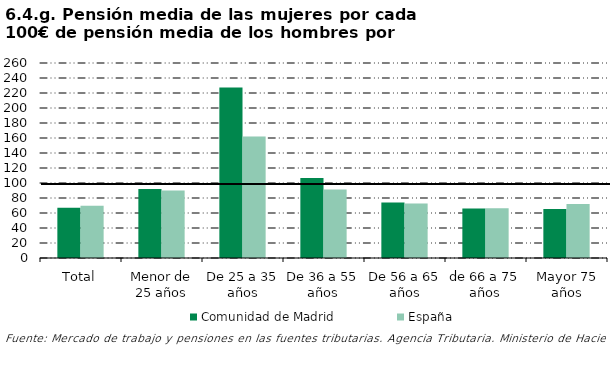
| Category | Comunidad de Madrid | España |
|---|---|---|
| Total | 66.907 | 69.539 |
| Menor de 25 años | 91.849 | 90.013 |
| De 25 a 35 años | 227.292 | 161.935 |
| De 36 a 55 años | 106.568 | 91.229 |
| De 56 a 65 años | 74.146 | 72.635 |
| de 66 a 75 años | 65.922 | 66.392 |
| Mayor 75 años | 65.339 | 71.909 |